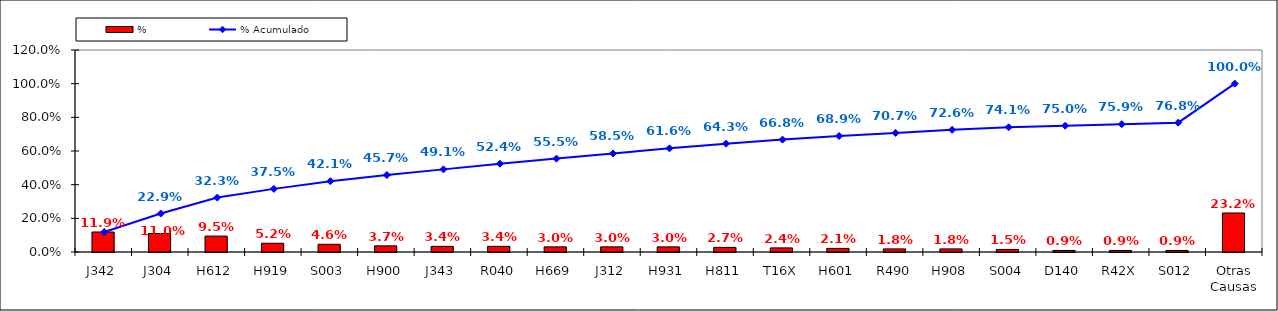
| Category | % |
|---|---|
| J342 | 0.119 |
| J304 | 0.11 |
| H612 | 0.095 |
| H919 | 0.052 |
| S003 | 0.046 |
| H900 | 0.037 |
| J343 | 0.034 |
| R040 | 0.034 |
| H669 | 0.03 |
| J312 | 0.03 |
| H931 | 0.03 |
| H811 | 0.027 |
| T16X | 0.024 |
| H601 | 0.021 |
| R490 | 0.018 |
| H908 | 0.018 |
| S004 | 0.015 |
| D140 | 0.009 |
| R42X | 0.009 |
| S012 | 0.009 |
| Otras Causas | 0.232 |